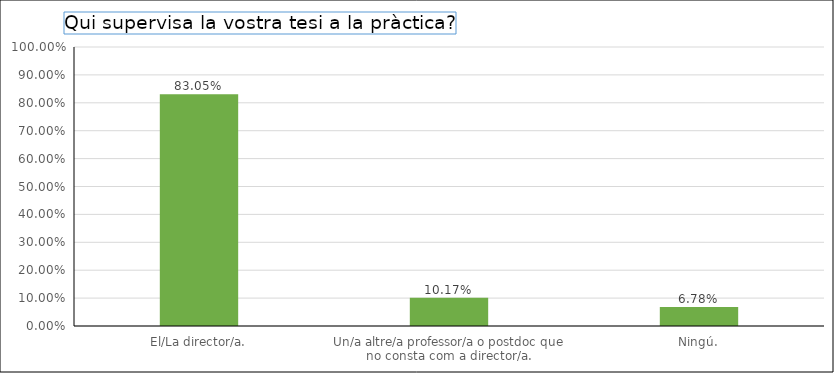
| Category | Series 0 |
|---|---|
| El/La director/a. | 0.831 |
| Un/a altre/a professor/a o postdoc que no consta com a director/a. | 0.102 |
| Ningú. | 0.068 |